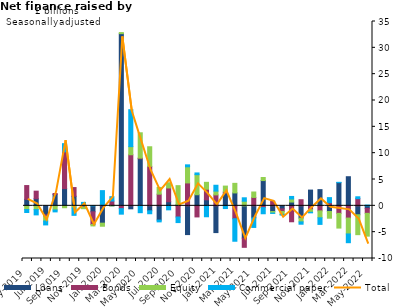
| Category | Loans | Bonds | Equity | Commercial paper |
|---|---|---|---|---|
| May-2019 | 1.229 | 2.622 | -0.704 | -0.561 |
| Jun-2019 | 1.349 | 1.437 | -0.718 | -1.001 |
| Jul-2019 | -1.698 | -0.281 | -0.902 | -0.742 |
| Aug-2019 | 2.172 | 0.174 | -0.792 | -0.357 |
| Sep-2019 | 3.277 | 6.981 | -0.36 | 1.548 |
| Oct-2019 | 1.817 | 1.651 | -0.392 | -1.416 |
| Nov-2019 | -0.055 | -0.195 | -0.293 | 0.654 |
| Dec-2019 | -1.136 | -2.415 | -0.262 | 0.031 |
| Jan-2020 | -3.289 | 0.155 | -0.587 | 2.731 |
| Feb-2020 | 0.145 | 0.764 | -0.001 | 0.826 |
| Mar-2020 | 32.693 | -0.54 | 0.2 | -1.041 |
| Apr-2020 | -0.566 | 9.698 | 1.542 | 7.014 |
| May-2020 | 8.936 | 0.131 | 4.803 | -1.303 |
| Jun-2020 | -0.938 | 7.494 | 3.723 | -0.564 |
| Jul-2020 | -2.706 | 2.212 | 1.287 | -0.34 |
| Aug-2020 | 0.78 | 2.614 | 0.989 | -0.762 |
| Sep-2020 | 0.214 | -2.122 | 3.617 | -1.058 |
| Oct-2020 | -5.46 | 4.349 | 3.067 | 0.366 |
| Nov-2020 | 2.106 | -2.106 | 3.812 | 0.327 |
| Dec-2020 | 1.14 | 2.015 | 1.308 | -2.076 |
| Jan-2021 | -5.081 | 2.081 | 0.717 | 1.11 |
| Feb-2021 | 2.463 | 0.193 | 1.093 | -0.517 |
| Mar-2021 | 2.45 | -2.452 | 1.819 | -4.272 |
| Apr-2021 | -6.125 | -1.754 | 0.875 | 0.65 |
| May-2021 | -2.285 | 1.596 | 1.031 | -1.817 |
| Jun-2021 | 4.798 | -0.338 | 0.579 | -1.166 |
| Jul-2021 | -1.084 | 0.867 | -0.281 | -0.072 |
| Aug-2021 | -0.583 | -0.499 | -0.536 | -0.136 |
| Sep-2021 | 0.715 | -3.026 | 0.586 | 0.481 |
| Oct-2021 | -2.336 | 1.158 | -0.708 | -0.446 |
| Nov-2021 | 2.99 | -0.729 | -0.494 | -0.107 |
| Dec-2021 | 3.076 | -0.957 | -1.316 | -1.25 |
| Jan-2022 | -1.08 | 0.598 | -1.269 | 0.961 |
| Feb-2022 | 4.407 | -1.431 | -2.792 | 0.058 |
| Mar-2022 | 5.528 | -2.323 | -3.014 | -1.663 |
| Apr-2022 | -1.693 | 1.362 | -3.782 | 0.359 |
| May-2022 | -0.483 | -0.942 | -4.328 | 0.142 |